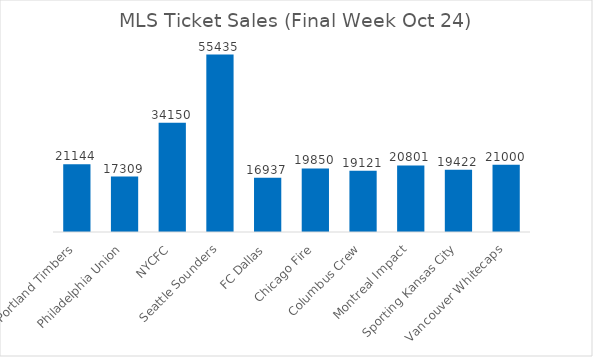
| Category | Ticket Sales |
|---|---|
| Portland Timbers | 21144 |
| Philadelphia Union | 17309 |
| NYCFC | 34150 |
| Seattle Sounders | 55435 |
| FC Dallas | 16937 |
| Chicago Fire | 19850 |
| Columbus Crew | 19121 |
| Montreal Impact | 20801 |
| Sporting Kansas City | 19422 |
| Vancouver Whitecaps | 21000 |